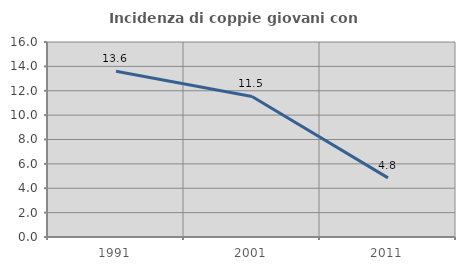
| Category | Incidenza di coppie giovani con figli |
|---|---|
| 1991.0 | 13.602 |
| 2001.0 | 11.533 |
| 2011.0 | 4.849 |